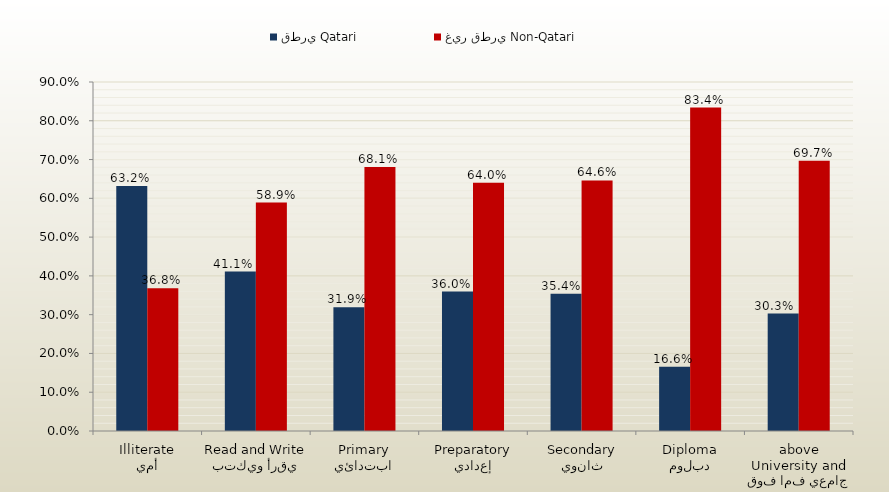
| Category | قطري Qatari | غير قطري Non-Qatari |
|---|---|---|
| أمي
Illiterate | 0.632 | 0.368 |
| يقرأ ويكتب
Read and Write | 0.411 | 0.589 |
| ابتدائي
Primary | 0.319 | 0.681 |
| إعدادي
Preparatory | 0.36 | 0.64 |
| ثانوي
Secondary | 0.354 | 0.646 |
| دبلوم
Diploma | 0.166 | 0.834 |
| جامعي فما فوق
University and above | 0.303 | 0.697 |